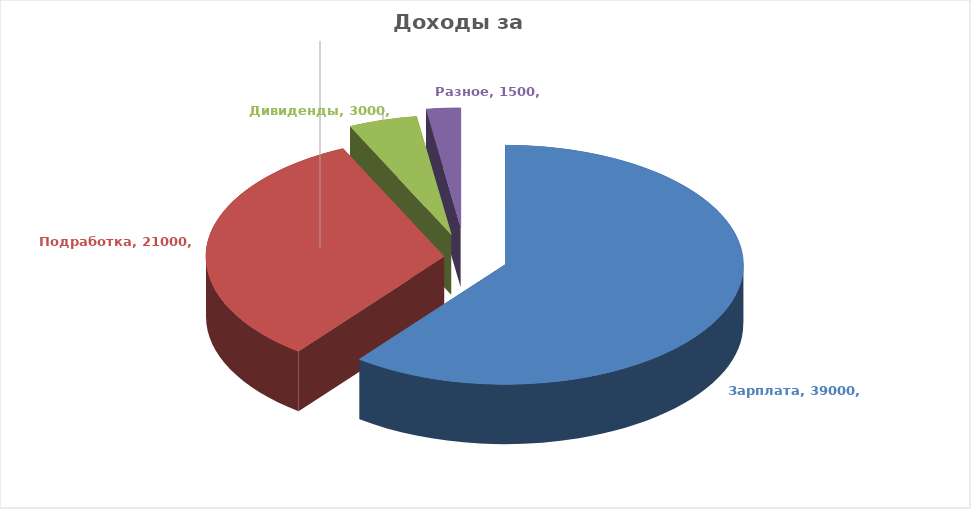
| Category | Series 3 | Series 0 | Series 1 | Series 2 |
|---|---|---|---|---|
| Зарплата | 39000 |  |  | 39000 |
| Подработка | 21000 |  |  | 21000 |
| Дивиденды | 3000 |  |  | 3000 |
| Разное | 1500 |  |  | 1500 |